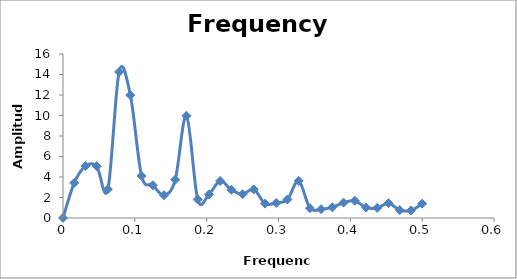
| Category | Frequency spectra |
|---|---|
| 0.0 | 0.004 |
| 0.015625 | 3.421 |
| 0.03125 | 5.061 |
| 0.046875 | 5.056 |
| 0.0625 | 2.802 |
| 0.078125 | 14.253 |
| 0.09375 | 11.989 |
| 0.109375 | 4.111 |
| 0.125 | 3.197 |
| 0.140625 | 2.222 |
| 0.15625 | 3.735 |
| 0.171875 | 9.975 |
| 0.1875 | 1.815 |
| 0.203125 | 2.297 |
| 0.21875 | 3.613 |
| 0.234375 | 2.754 |
| 0.25 | 2.323 |
| 0.265625 | 2.792 |
| 0.28125 | 1.403 |
| 0.296875 | 1.468 |
| 0.3125 | 1.806 |
| 0.328125 | 3.62 |
| 0.34375 | 0.952 |
| 0.359375 | 0.861 |
| 0.375 | 1.047 |
| 0.390625 | 1.5 |
| 0.40625 | 1.68 |
| 0.421875 | 1.017 |
| 0.4375 | 0.982 |
| 0.453125 | 1.444 |
| 0.46875 | 0.771 |
| 0.484375 | 0.733 |
| 0.5 | 1.4 |